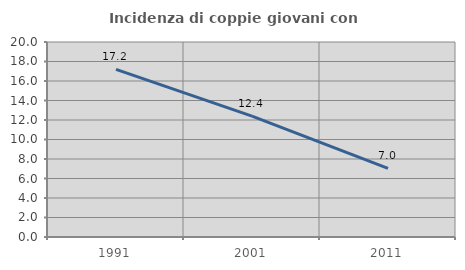
| Category | Incidenza di coppie giovani con figli |
|---|---|
| 1991.0 | 17.195 |
| 2001.0 | 12.39 |
| 2011.0 | 7.036 |